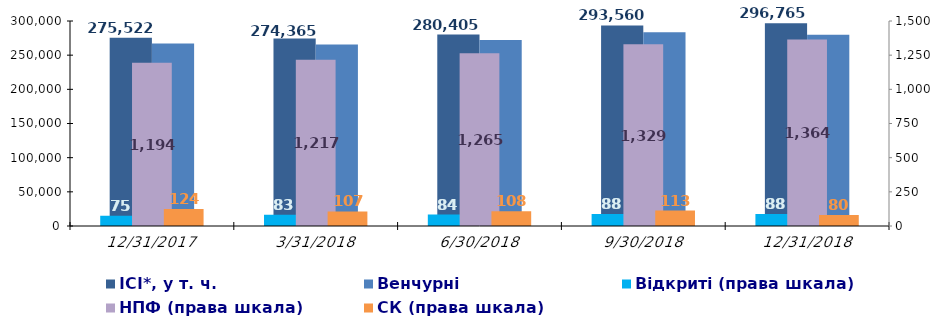
| Category | ІСІ*, у т. ч. | Венчурні |
|---|---|---|
| 12/31/17 | 275522.311 | 267000.791 |
| 3/31/18 | 274364.654 | 265684.134 |
| 6/30/18 | 280405.018 | 272052.334 |
| 9/30/18 | 293559.598 | 283620.683 |
| 12/31/18 | 296765.381 | 279713.253 |